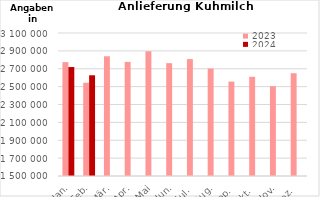
| Category | 2023 | 2024 |
|---|---|---|
| Jan. | 2774395.672 | 2719197.995 |
| Feb. | 2543432.372 | 2626798.032 |
| Mär. | 2839645.633 | 0 |
| Apr. | 2776676.837 | 0 |
| Mai | 2895424.25 | 0 |
| Jun. | 2762643.654 | 0 |
| Jul. | 2808531.242 | 0 |
| Aug. | 2701954.533 | 0 |
| Sep. | 2556397.834 | 0 |
| Okt. | 2610053.259 | 0 |
| Nov. | 2504309.96 | 0 |
| Dez. | 2650239.522 | 0 |